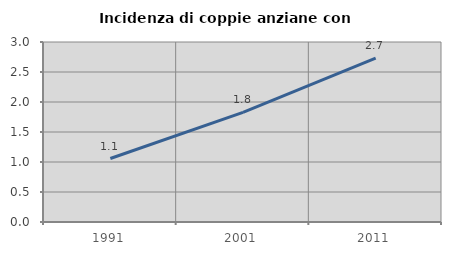
| Category | Incidenza di coppie anziane con figli |
|---|---|
| 1991.0 | 1.058 |
| 2001.0 | 1.826 |
| 2011.0 | 2.73 |